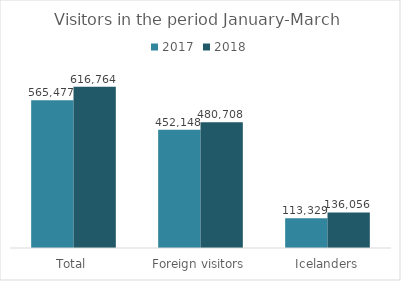
| Category | 2017 | 2018 |
|---|---|---|
| Total | 565477 | 616764 |
| Foreign visitors | 452148 | 480708 |
| Icelanders | 113329 | 136056 |